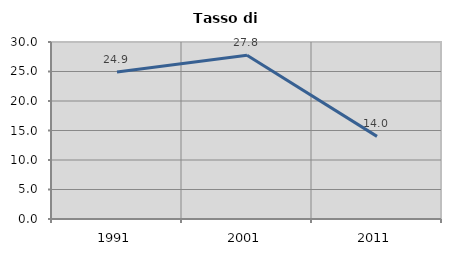
| Category | Tasso di disoccupazione   |
|---|---|
| 1991.0 | 24.928 |
| 2001.0 | 27.761 |
| 2011.0 | 14.002 |